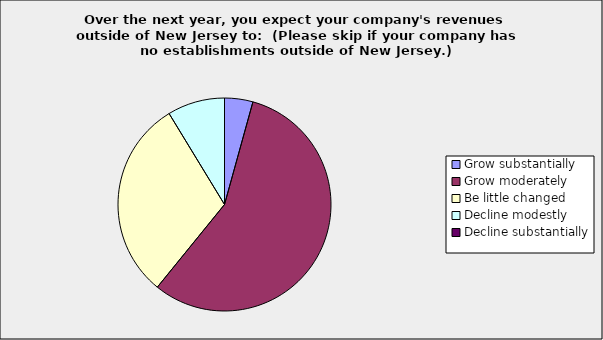
| Category | Series 0 |
|---|---|
| Grow substantially | 0.043 |
| Grow moderately | 0.565 |
| Be little changed | 0.304 |
| Decline modestly | 0.087 |
| Decline substantially | 0 |